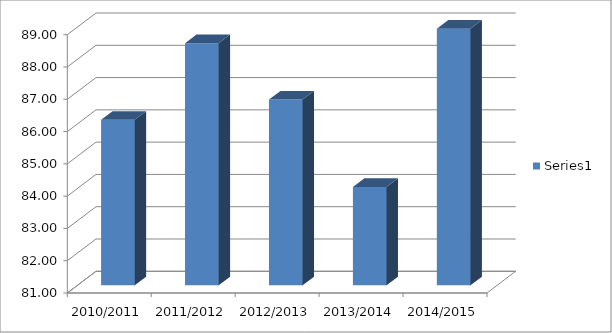
| Category | Series 0 |
|---|---|
| 2010/2011 | 86.127 |
| 2011/2012 | 88.503 |
| 2012/2013 | 86.754 |
| 2013/2014 | 84.048 |
| 2014/2015 | 88.947 |